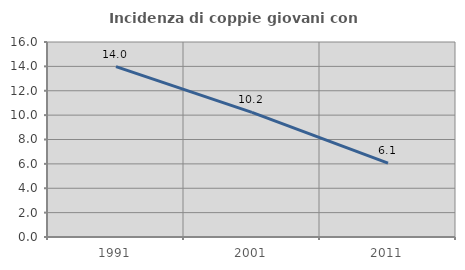
| Category | Incidenza di coppie giovani con figli |
|---|---|
| 1991.0 | 13.984 |
| 2001.0 | 10.225 |
| 2011.0 | 6.056 |